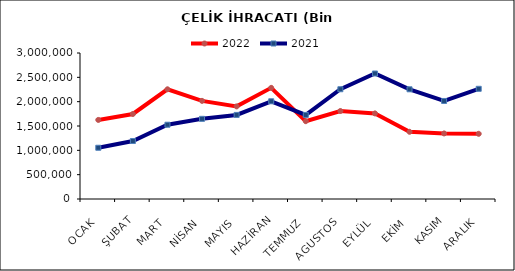
| Category | 2022 | 2021 |
|---|---|---|
| OCAK | 1624868.77 | 1052767.473 |
| ŞUBAT | 1746728.877 | 1191709.995 |
| MART | 2254353.969 | 1526133.413 |
| NİSAN | 2016338.414 | 1647164.786 |
| MAYIS | 1903135.322 | 1727666.49 |
| HAZİRAN | 2283676.611 | 2007804.701 |
| TEMMUZ | 1598889.859 | 1727114.102 |
| AGUSTOS | 1808197.255 | 2255362.41 |
| EYLÜL | 1758704.293 | 2578495.236 |
| EKİM | 1380920.81 | 2253924.815 |
| KASIM | 1347206.638 | 2014222.388 |
| ARALIK | 1339547.672 | 2264429.865 |